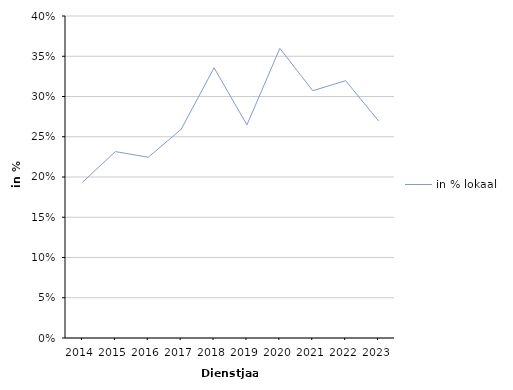
| Category | in % lokaal |
|---|---|
| 2014 | 0.193 |
| 2015 | 0.232 |
| 2016 | 0.225 |
| 2017 | 0.259 |
| 2018 | 0.336 |
| 2019 | 0.265 |
| 2020 | 0.36 |
| 2021 | 0.307 |
| 2022 | 0.32 |
| 2023 | 0.27 |